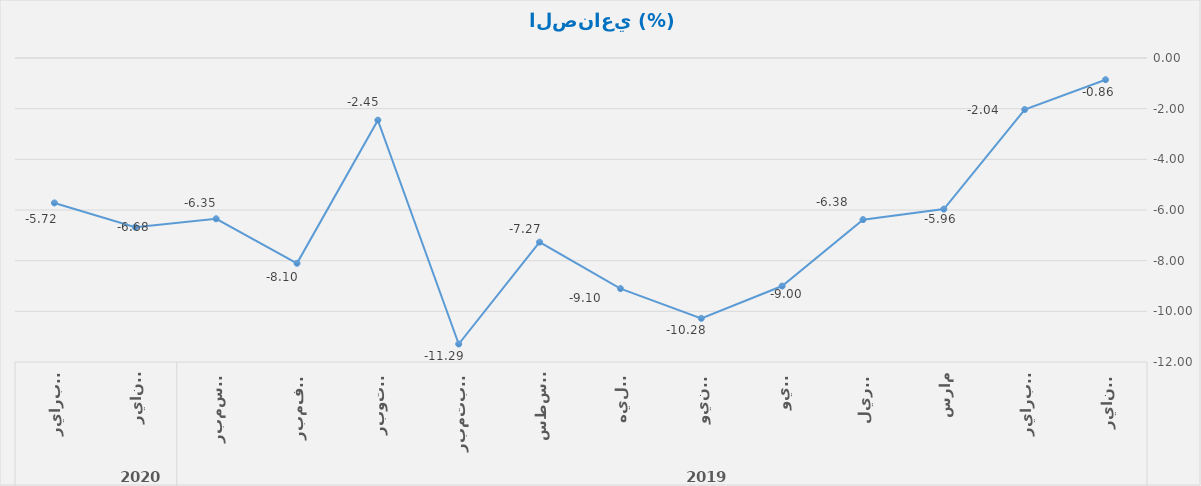
| Category | Series 0 |
|---|---|
| 0 | -0.857 |
| 1 | -2.035 |
| 2 | -5.964 |
| 3 | -6.38 |
| 4 | -9.002 |
| 5 | -10.277 |
| 6 | -9.102 |
| 7 | -7.269 |
| 8 | -11.29 |
| 9 | -2.453 |
| 10 | -8.104 |
| 11 | -6.346 |
| 12 | -6.678 |
| 13 | -5.721 |